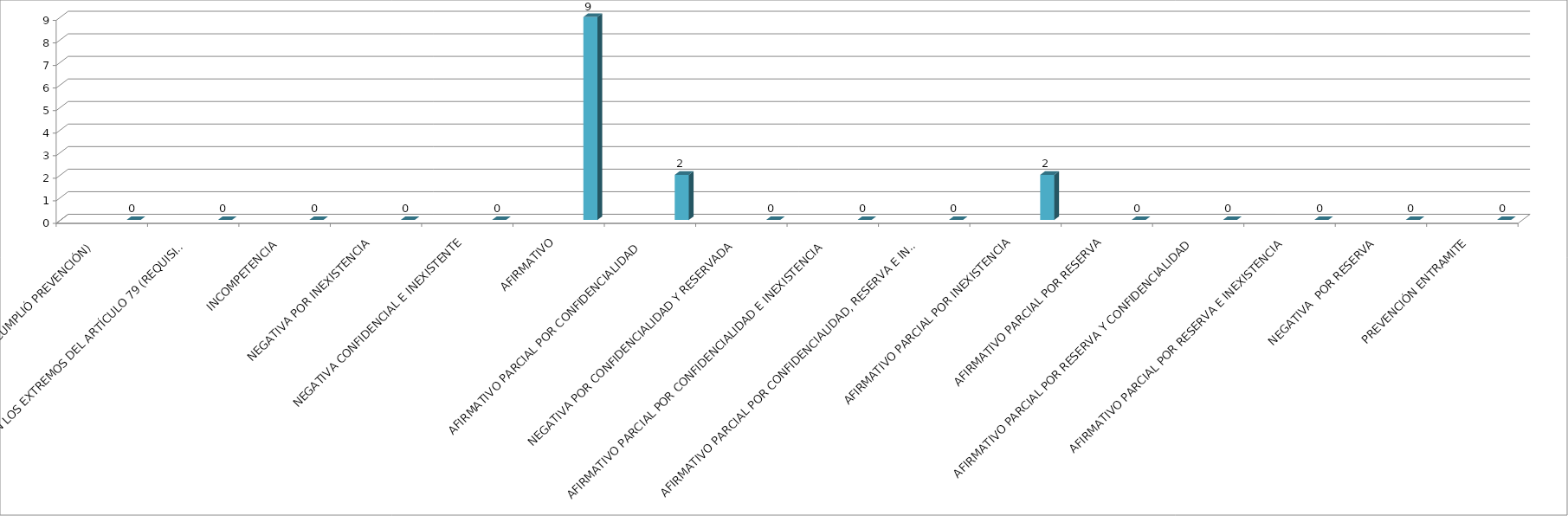
| Category | Series 0 | Series 1 | Series 2 | Series 3 | Series 4 |
|---|---|---|---|---|---|
| SE TIENE POR NO PRESENTADA ( NO CUMPLIÓ PREVENCIÓN) |  |  |  |  | 0 |
| NO CUMPLIO CON LOS EXTREMOS DEL ARTÍCULO 79 (REQUISITOS) |  |  |  |  | 0 |
| INCOMPETENCIA  |  |  |  |  | 0 |
| NEGATIVA POR INEXISTENCIA |  |  |  |  | 0 |
| NEGATIVA CONFIDENCIAL E INEXISTENTE |  |  |  |  | 0 |
| AFIRMATIVO |  |  |  |  | 9 |
| AFIRMATIVO PARCIAL POR CONFIDENCIALIDAD  |  |  |  |  | 2 |
| NEGATIVA POR CONFIDENCIALIDAD Y RESERVADA |  |  |  |  | 0 |
| AFIRMATIVO PARCIAL POR CONFIDENCIALIDAD E INEXISTENCIA |  |  |  |  | 0 |
| AFIRMATIVO PARCIAL POR CONFIDENCIALIDAD, RESERVA E INEXISTENCIA |  |  |  |  | 0 |
| AFIRMATIVO PARCIAL POR INEXISTENCIA |  |  |  |  | 2 |
| AFIRMATIVO PARCIAL POR RESERVA |  |  |  |  | 0 |
| AFIRMATIVO PARCIAL POR RESERVA Y CONFIDENCIALIDAD |  |  |  |  | 0 |
| AFIRMATIVO PARCIAL POR RESERVA E INEXISTENCIA |  |  |  |  | 0 |
| NEGATIVA  POR RESERVA |  |  |  |  | 0 |
| PREVENCIÓN ENTRAMITE |  |  |  |  | 0 |